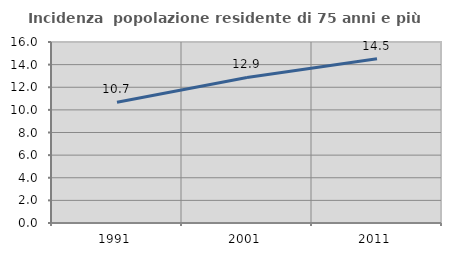
| Category | Incidenza  popolazione residente di 75 anni e più |
|---|---|
| 1991.0 | 10.681 |
| 2001.0 | 12.868 |
| 2011.0 | 14.528 |